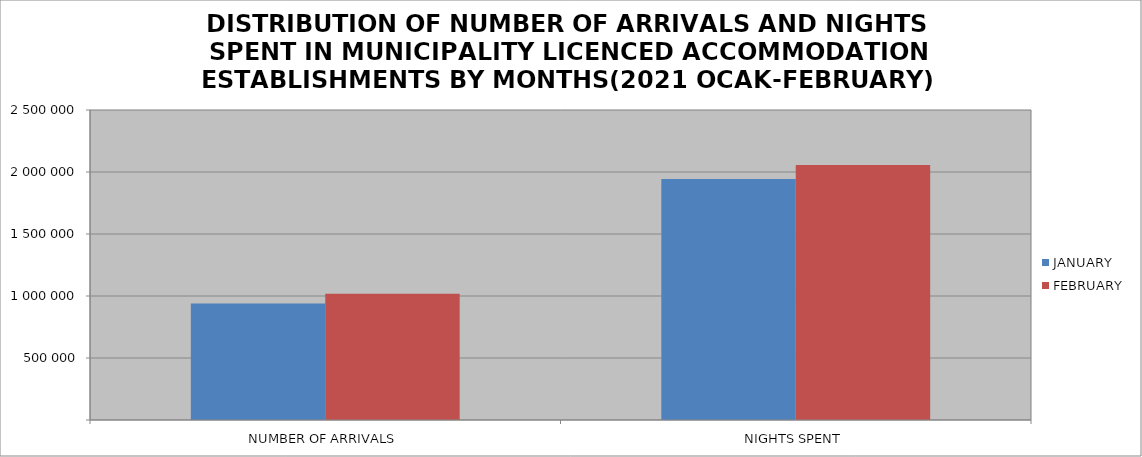
| Category | JANUARY | FEBRUARY |
|---|---|---|
| NUMBER OF ARRIVALS | 940331 | 1017199 |
| NIGHTS SPENT | 1943007 | 2056594 |